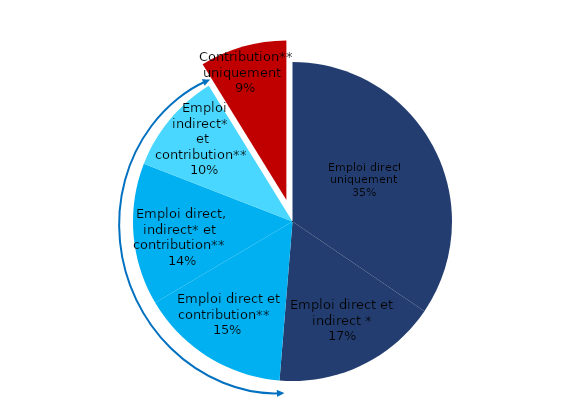
| Category | Series 0 |
|---|---|
| 0 | 34.5 |
| 1 | 16.8 |
| 2 | 15.2 |
| 3 | 14.4 |
| 4 | 10.3 |
| 5 | 8.8 |